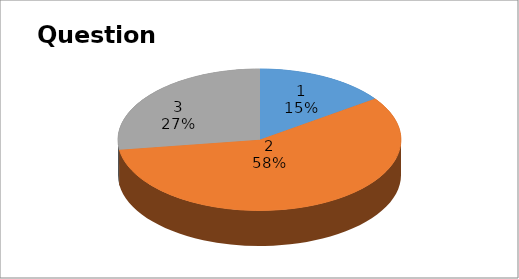
| Category | Series 0 |
|---|---|
| 0 | 5 |
| 1 | 19 |
| 2 | 9 |